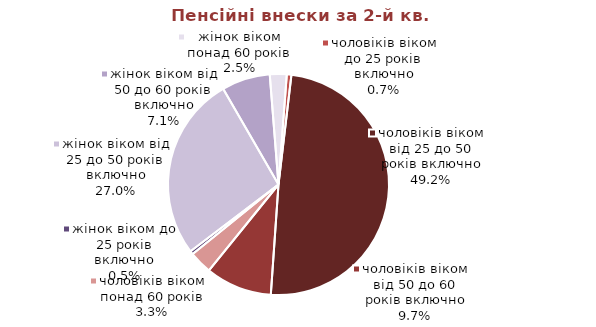
| Category | Series 0 |
|---|---|
| жінок віком до 25 років включно | 0.271 |
| жінок віком від 25 до 50 років включно | 14.71 |
| жінок віком від 50 до 60 років включно | 3.86 |
| жінок віком понад 60 років | 1.342 |
| чоловіків віком до 25 років включно | 0.366 |
| чоловіків віком від 25 до 50 років включно | 26.839 |
| чоловіків віком від 50 до 60 років включно | 5.294 |
| чоловіків віком понад 60 років | 1.823 |